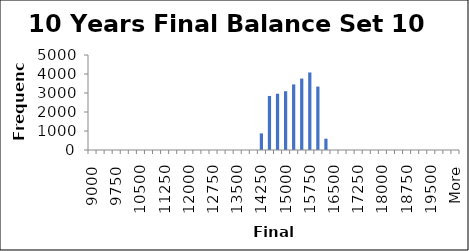
| Category | Frequency |
|---|---|
| 9000.0 | 0 |
| 9250.0 | 0 |
| 9500.0 | 0 |
| 9750.0 | 0 |
| 10000.0 | 0 |
| 10250.0 | 0 |
| 10500.0 | 0 |
| 10750.0 | 0 |
| 11000.0 | 0 |
| 11250.0 | 0 |
| 11500.0 | 0 |
| 11750.0 | 0 |
| 12000.0 | 0 |
| 12250.0 | 0 |
| 12500.0 | 0 |
| 12750.0 | 0 |
| 13000.0 | 0 |
| 13250.0 | 0 |
| 13500.0 | 0 |
| 13750.0 | 0 |
| 14000.0 | 0 |
| 14250.0 | 874 |
| 14500.0 | 2844 |
| 14750.0 | 2962 |
| 15000.0 | 3093 |
| 15250.0 | 3453 |
| 15500.0 | 3760 |
| 15750.0 | 4081 |
| 16000.0 | 3338 |
| 16250.0 | 595 |
| 16500.0 | 0 |
| 16750.0 | 0 |
| 17000.0 | 0 |
| 17250.0 | 0 |
| 17500.0 | 0 |
| 17750.0 | 0 |
| 18000.0 | 0 |
| 18250.0 | 0 |
| 18500.0 | 0 |
| 18750.0 | 0 |
| 19000.0 | 0 |
| 19250.0 | 0 |
| 19500.0 | 0 |
| 19750.0 | 0 |
| 20000.0 | 0 |
| More | 0 |